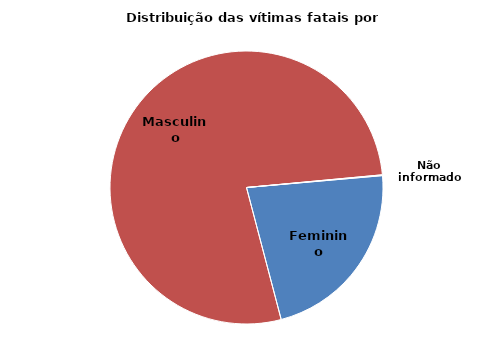
| Category | Series 0 |
|---|---|
| Feminino | 466 |
| Masculino | 1622 |
| Não informado | 2 |